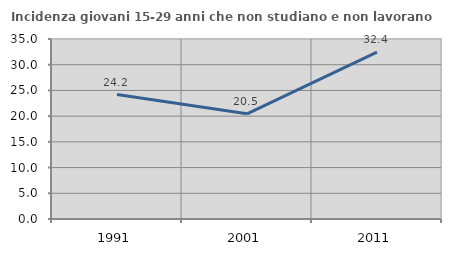
| Category | Incidenza giovani 15-29 anni che non studiano e non lavorano  |
|---|---|
| 1991.0 | 24.206 |
| 2001.0 | 20.455 |
| 2011.0 | 32.432 |